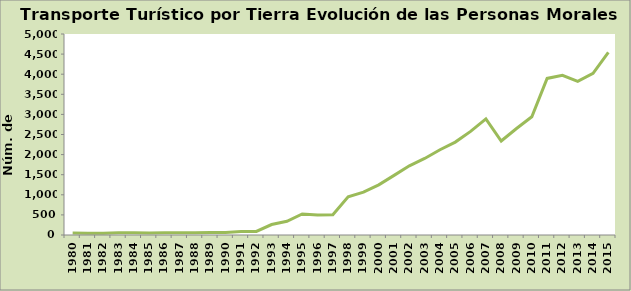
| Category | Series 0 |
|---|---|
| 1980.0 | 50 |
| 1981.0 | 44 |
| 1982.0 | 46 |
| 1983.0 | 54 |
| 1984.0 | 54 |
| 1985.0 | 51 |
| 1986.0 | 56 |
| 1987.0 | 56 |
| 1988.0 | 58 |
| 1989.0 | 60 |
| 1990.0 | 60 |
| 1991.0 | 85 |
| 1992.0 | 90 |
| 1993.0 | 261 |
| 1994.0 | 342 |
| 1995.0 | 523 |
| 1996.0 | 498 |
| 1997.0 | 503 |
| 1998.0 | 948 |
| 1999.0 | 1065 |
| 2000.0 | 1248 |
| 2001.0 | 1483 |
| 2002.0 | 1722 |
| 2003.0 | 1904 |
| 2004.0 | 2120 |
| 2005.0 | 2311 |
| 2006.0 | 2577 |
| 2007.0 | 2888 |
| 2008.0 | 2338 |
| 2009.0 | 2649 |
| 2010.0 | 2942 |
| 2011.0 | 3895 |
| 2012.0 | 3972 |
| 2013.0 | 3820 |
| 2014.0 | 4020 |
| 2015.0 | 4542 |